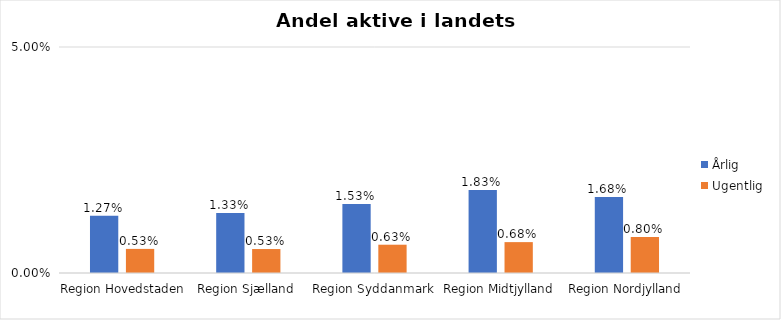
| Category | Årlig | Ugentlig |
|---|---|---|
| Region Hovedstaden | 0.013 | 0.005 |
| Region Sjælland | 0.013 | 0.005 |
| Region Syddanmark | 0.015 | 0.006 |
| Region Midtjylland | 0.018 | 0.007 |
| Region Nordjylland | 0.017 | 0.008 |